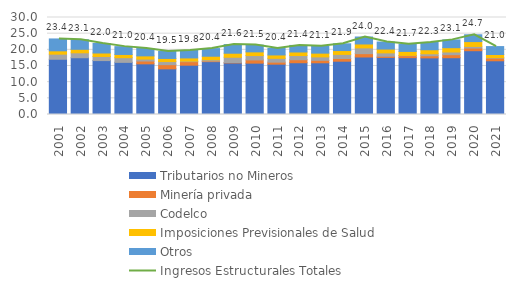
| Category | Tributarios no Mineros | Minería privada | Codelco  | Imposiciones Previsionales de Salud  | Otros |
|---|---|---|---|---|---|
| 2001.0 | 17.088 | 0 | 1.575 | 1.036 | 3.669 |
| 2002.0 | 17.558 | 0 | 1.519 | 1.08 | 2.964 |
| 2003.0 | 16.672 | 0 | 1.284 | 1.065 | 2.945 |
| 2004.0 | 16.125 | 0 | 1.447 | 0.997 | 2.421 |
| 2005.0 | 15.665 | 0.874 | 0.603 | 0.989 | 2.272 |
| 2006.0 | 14.119 | 1.294 | 0.957 | 0.968 | 2.155 |
| 2007.0 | 15.251 | 1.085 | 0.177 | 0.986 | 2.291 |
| 2008.0 | 16.351 | 0.199 | 0.384 | 1.088 | 2.364 |
| 2009.0 | 15.943 | 0.141 | 1.624 | 1.244 | 2.667 |
| 2010.0 | 15.882 | 1.004 | 1.347 | 1.141 | 2.086 |
| 2011.0 | 15.567 | 0.623 | 1.187 | 1.047 | 2.006 |
| 2012.0 | 16.01 | 0.927 | 1.3 | 1.1 | 2.026 |
| 2013.0 | 15.993 | 0.763 | 1.062 | 1.159 | 2.151 |
| 2014.0 | 16.483 | 0.846 | 1.262 | 1.187 | 2.092 |
| 2015.0 | 17.785 | 1.034 | 1.781 | 1.212 | 2.153 |
| 2016.0 | 17.655 | 0.372 | 1.027 | 1.186 | 2.176 |
| 2017.0 | 17.579 | 0.603 | 0.093 | 1.235 | 2.182 |
| 2018.0 | 17.513 | 0.652 | 0.622 | 1.237 | 2.252 |
| 2019.0 | 17.557 | 0.938 | 0.837 | 1.33 | 2.414 |
| 2020.0 | 19.731 | 0.815 | 0.517 | 1.487 | 2.112 |
| 2021.0 | 16.614 | 0.803 | 0.172 | 0.969 | 2.448 |